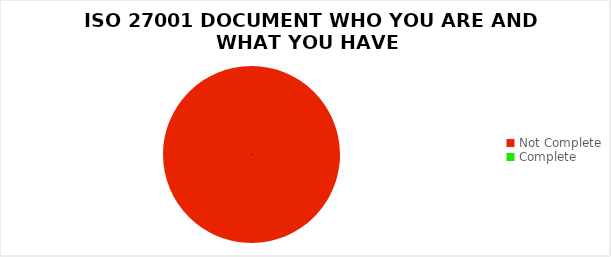
| Category | Series 0 |
|---|---|
| Not Complete | 10 |
| Complete | 0 |